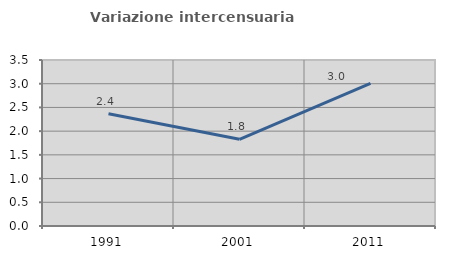
| Category | Variazione intercensuaria annua |
|---|---|
| 1991.0 | 2.365 |
| 2001.0 | 1.829 |
| 2011.0 | 3.009 |